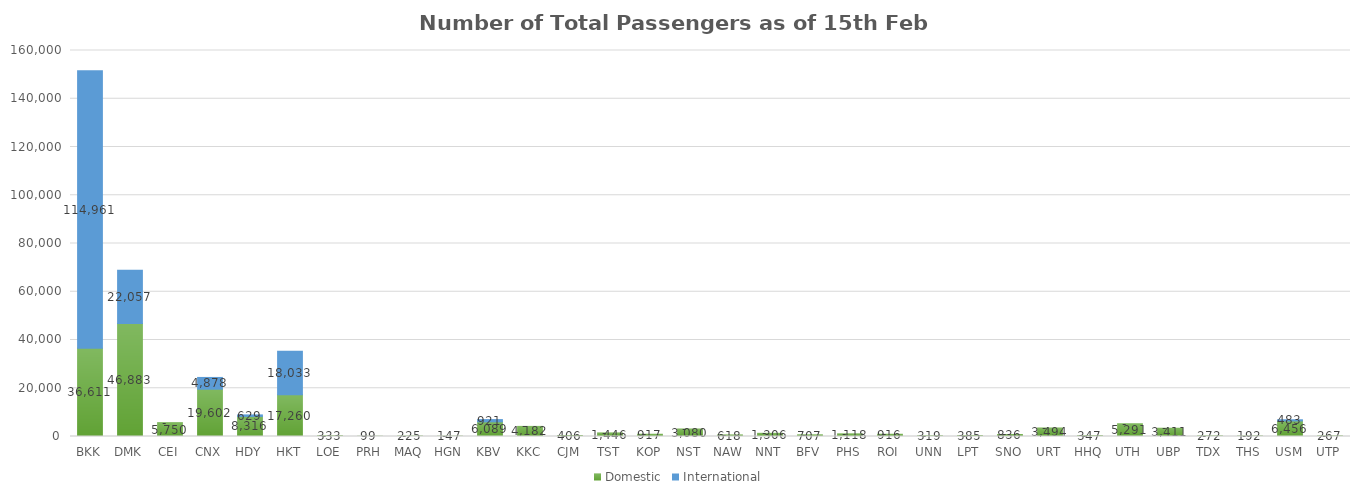
| Category | Domestic | International |
|---|---|---|
| BKK | 36611 | 114961 |
| DMK | 46883 | 22057 |
| CEI | 5750 | 0 |
| CNX | 19602 | 4878 |
| HDY | 8316 | 629 |
| HKT | 17260 | 18033 |
| LOE | 333 | 0 |
| PRH | 99 | 0 |
| MAQ | 225 | 0 |
| HGN | 147 | 0 |
| KBV | 6089 | 921 |
| KKC | 4182 | 0 |
| CJM | 406 | 0 |
| TST | 1446 | 0 |
| KOP | 917 | 0 |
| NST | 3080 | 0 |
| NAW | 618 | 0 |
| NNT | 1306 | 0 |
| BFV | 707 | 0 |
| PHS | 1118 | 0 |
| ROI | 916 | 0 |
| UNN | 319 | 0 |
| LPT | 385 | 0 |
| SNO | 836 | 0 |
| URT | 3494 | 0 |
| HHQ | 347 | 0 |
| UTH | 5291 | 0 |
| UBP | 3411 | 0 |
| TDX | 272 | 0 |
| THS | 192 | 0 |
| USM | 6456 | 483 |
| UTP | 267 | 0 |